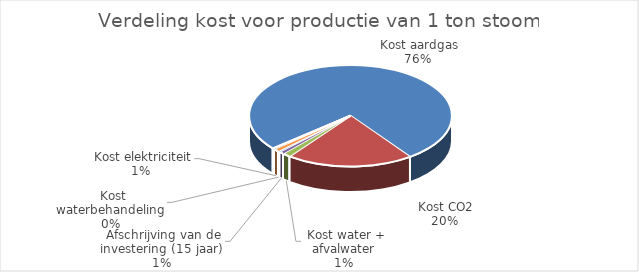
| Category | Series 0 |
|---|---|
|  Kost aardgas | 44.281 |
|  Kost CO2 | 11.746 |
|  Kost water + afvalwater | 0.778 |
|  Afschrijving van de investering (15 jaar) | 0.449 |
|  Kost waterbehandeling | 0.185 |
|  Kost elektriciteit | 0.522 |
|  Onderhoudskosten | 0.135 |
|  Opstartkosten ketels | 0.05 |